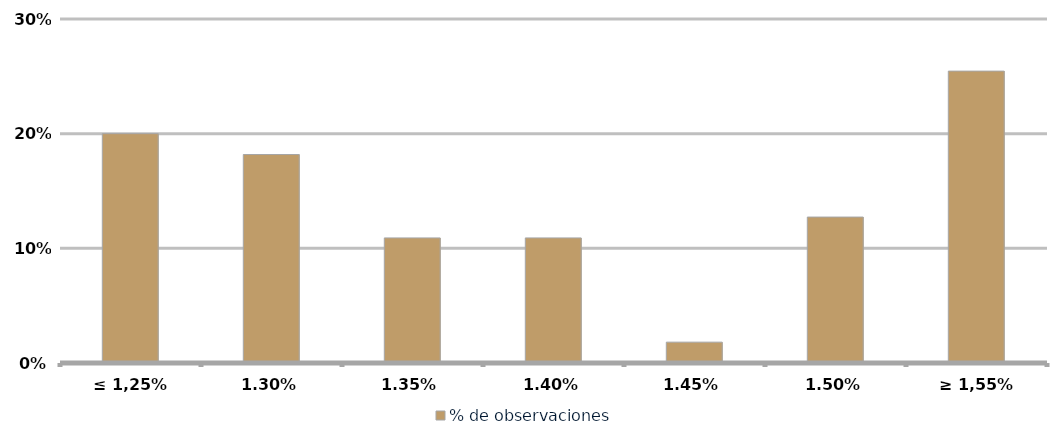
| Category | % de observaciones  |
|---|---|
| ≤ 1,25% | 0.2 |
| 1,30% | 0.182 |
| 1,35% | 0.109 |
| 1,40% | 0.109 |
| 1,45% | 0.018 |
| 1,50% | 0.127 |
| ≥ 1,55% | 0.255 |